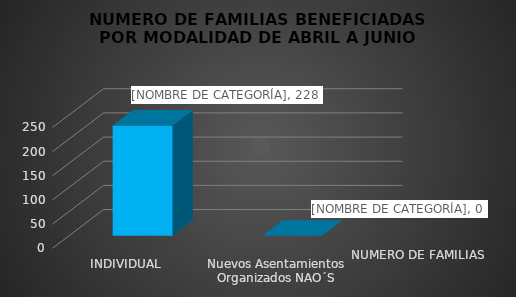
| Category | NUMERO DE FAMILIAS |
|---|---|
| INDIVIDUAL | 228 |
| Nuevos Asentamientos Organizados NAO´S | 0 |